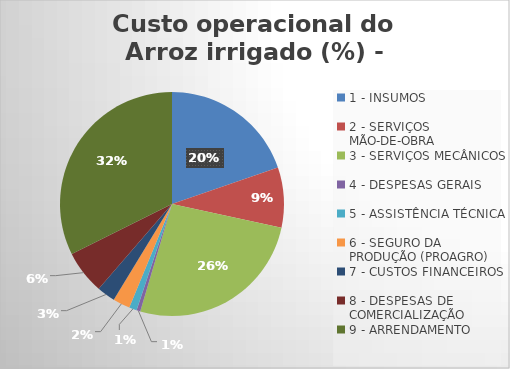
| Category | Series 0 |
|---|---|
| 1 - INSUMOS | 19.732 |
| 2 - SERVIÇOS MÃO-DE-OBRA | 8.652 |
| 3 - SERVIÇOS MECÂNICOS | 26.196 |
| 4 - DESPESAS GERAIS  | 0.546 |
| 5 - ASSISTÊNCIA TÉCNICA | 1.103 |
| 6 - SEGURO DA PRODUÇÃO (PROAGRO) | 2.481 |
| 7 - CUSTOS FINANCEIROS | 2.642 |
| 8 - DESPESAS DE COMERCIALIZAÇÃO | 6.296 |
| 9 - ARRENDAMENTO | 32.352 |